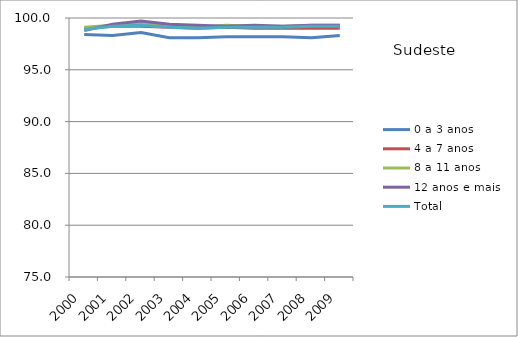
| Category | 0 a 3 anos | 4 a 7 anos | 8 a 11 anos | 12 anos e mais | Total |
|---|---|---|---|---|---|
| 2000.0 | 98.4 | 99 | 99.1 | 98.8 | 98.9 |
| 2001.0 | 98.3 | 99.2 | 99.3 | 99.4 | 99.2 |
| 2002.0 | 98.6 | 99.2 | 99.5 | 99.7 | 99.3 |
| 2003.0 | 98.1 | 99.1 | 99.2 | 99.4 | 99.1 |
| 2004.0 | 98.1 | 99 | 99.1 | 99.3 | 99 |
| 2005.0 | 98.2 | 99.1 | 99.3 | 99.2 | 99.1 |
| 2006.0 | 98.2 | 99 | 99.2 | 99.3 | 99.1 |
| 2007.0 | 98.2 | 99 | 99.2 | 99.2 | 99.1 |
| 2008.0 | 98.1 | 99 | 99.3 | 99.3 | 99.2 |
| 2009.0 | 98.3 | 99 | 99.3 | 99.3 | 99.2 |